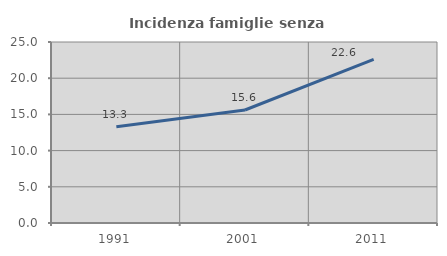
| Category | Incidenza famiglie senza nuclei |
|---|---|
| 1991.0 | 13.288 |
| 2001.0 | 15.609 |
| 2011.0 | 22.61 |